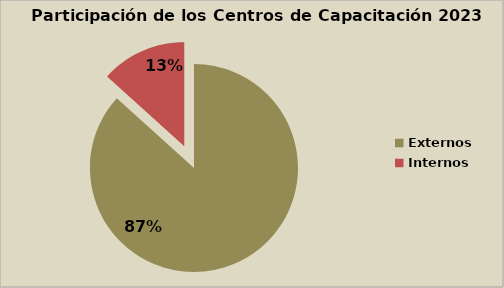
| Category | Series 0 |
|---|---|
| Externos | 86.681 |
| Internos | 13.319 |